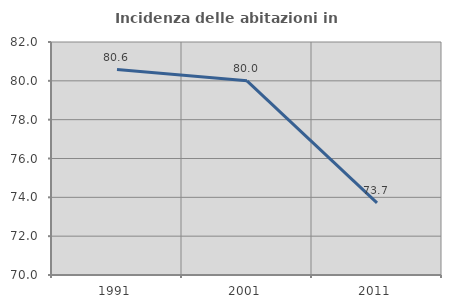
| Category | Incidenza delle abitazioni in proprietà  |
|---|---|
| 1991.0 | 80.583 |
| 2001.0 | 80 |
| 2011.0 | 73.714 |